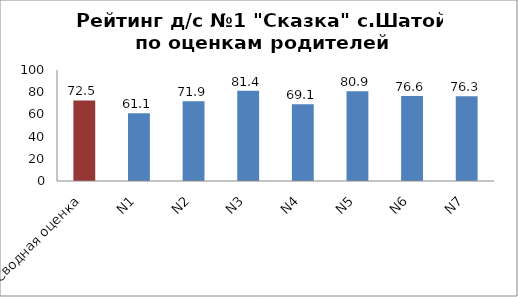
| Category | Series 0 |
|---|---|
| Сводная оценка | 72.544 |
| N1 | 61.056 |
| N2 | 71.923 |
| N3 | 81.369 |
| N4 | 69.112 |
| N5 | 80.923 |
| N6 | 76.566 |
| N7 | 76.275 |